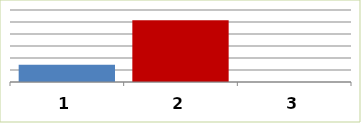
| Category | Series 0 |
|---|---|
| 0 | 14466788 |
| 1 | 51387206 |
| 2 | 0 |